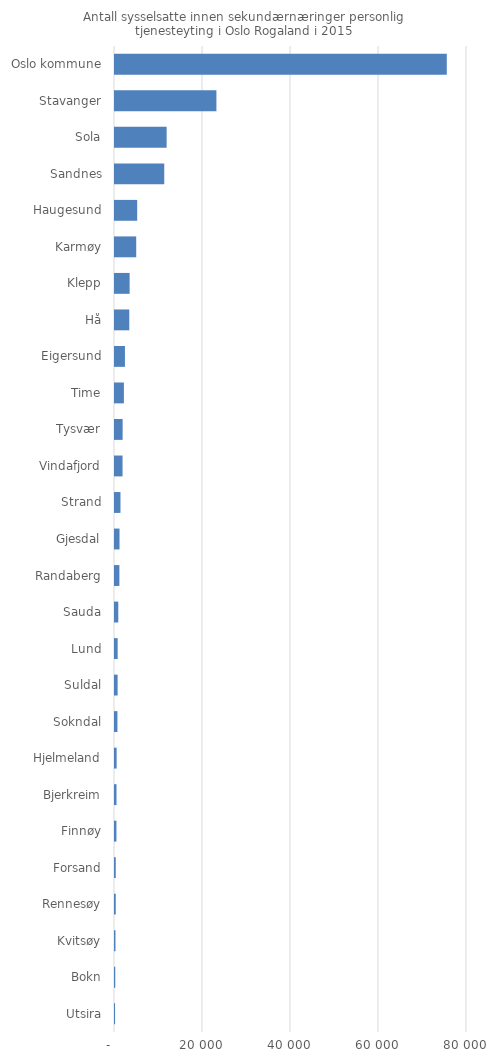
| Category | Totalt |
|---|---|
| Utsira | 15 |
| Bokn | 61 |
| Kvitsøy | 109 |
| Rennesøy | 173 |
| Forsand | 174 |
| Finnøy | 329 |
| Bjerkreim | 341 |
| Hjelmeland | 372 |
| Sokndal | 552 |
| Suldal | 596 |
| Lund | 604 |
| Sauda | 745 |
| Randaberg | 996 |
| Gjesdal | 1025 |
| Strand | 1243 |
| Vindafjord | 1716 |
| Tysvær | 1735 |
| Time | 2023 |
| Eigersund | 2260 |
| Hå | 3242 |
| Klepp | 3325 |
| Karmøy | 4820 |
| Haugesund | 5040 |
| Sandnes | 11189 |
| Sola | 11735 |
| Stavanger | 23049 |
| Oslo kommune | 75408 |